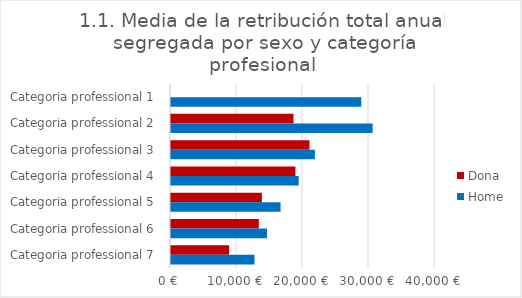
| Category | Dona | Home |
|---|---|---|
| Categoria professional 1 | 0 | 28833.333 |
| Categoria professional 2 | 18559 | 30550 |
| Categoria professional 3 | 20984 | 21800 |
| Categoria professional 4 | 18850 | 19350 |
| Categoria professional 5 | 13766.667 | 16600 |
| Categoria professional 6 | 13302.895 | 14550 |
| Categoria professional 7 | 8808.5 | 12650 |